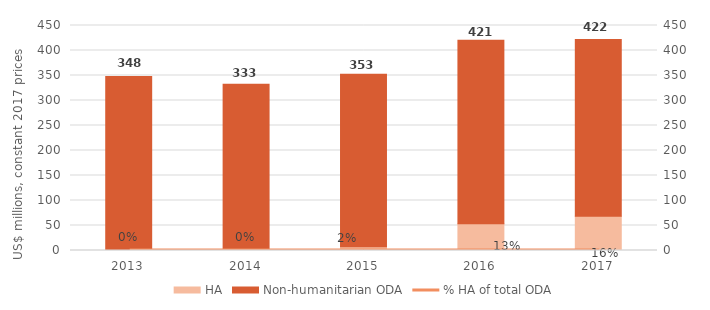
| Category | HA | Non-humanitarian ODA |
|---|---|---|
| 2013.0 | 0 | 348.241 |
| 2014.0 | 1.347 | 331.236 |
| 2015.0 | 7.712 | 344.936 |
| 2016.0 | 53.402 | 367.12 |
| 2017.0 | 68.535 | 353.255 |